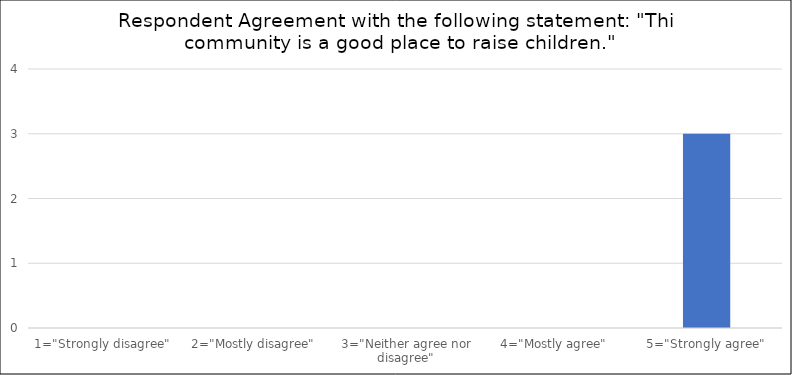
| Category | Number of Responses |
|---|---|
| 1="Strongly disagree" | 0 |
| 2="Mostly disagree" | 0 |
| 3="Neither agree nor disagree" | 0 |
| 4="Mostly agree" | 0 |
| 5="Strongly agree" | 3 |